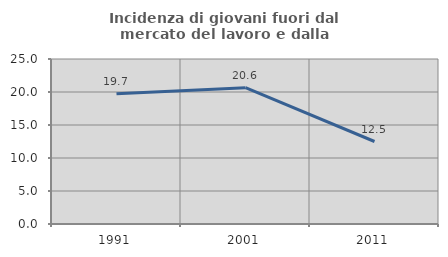
| Category | Incidenza di giovani fuori dal mercato del lavoro e dalla formazione  |
|---|---|
| 1991.0 | 19.743 |
| 2001.0 | 20.65 |
| 2011.0 | 12.5 |